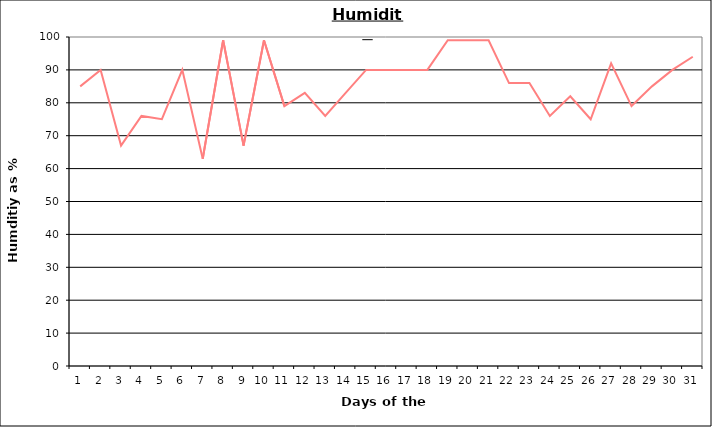
| Category | Series 0 |
|---|---|
| 0 | 85 |
| 1 | 90 |
| 2 | 67 |
| 3 | 76 |
| 4 | 75 |
| 5 | 90 |
| 6 | 63 |
| 7 | 99 |
| 8 | 67 |
| 9 | 99 |
| 10 | 79 |
| 11 | 83 |
| 12 | 76 |
| 13 | 83 |
| 14 | 90 |
| 15 | 90 |
| 16 | 90 |
| 17 | 90 |
| 18 | 99 |
| 19 | 99 |
| 20 | 99 |
| 21 | 86 |
| 22 | 86 |
| 23 | 76 |
| 24 | 82 |
| 25 | 75 |
| 26 | 92 |
| 27 | 79 |
| 28 | 85 |
| 29 | 90 |
| 30 | 94 |